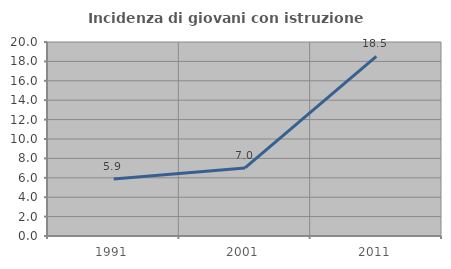
| Category | Incidenza di giovani con istruzione universitaria |
|---|---|
| 1991.0 | 5.882 |
| 2001.0 | 7.018 |
| 2011.0 | 18.519 |